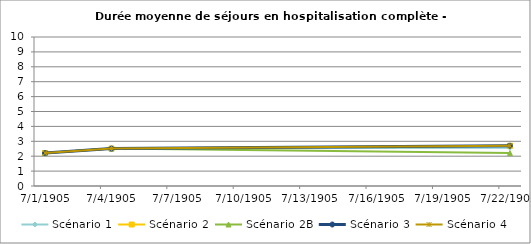
| Category | Scénario 1 | Scénario 2 | Scénario 2B | Scénario 3 | Scénario 4 |
|---|---|---|---|---|---|
| 2009.0 | 2.213 | 2.213 | 2.213 | 2.213 | 2.213 |
| 2012.0 | 2.513 | 2.513 | 2.513 | 2.513 | 2.513 |
| 2030.0 | 2.574 | 2.701 | 2.213 | 2.701 | 2.701 |